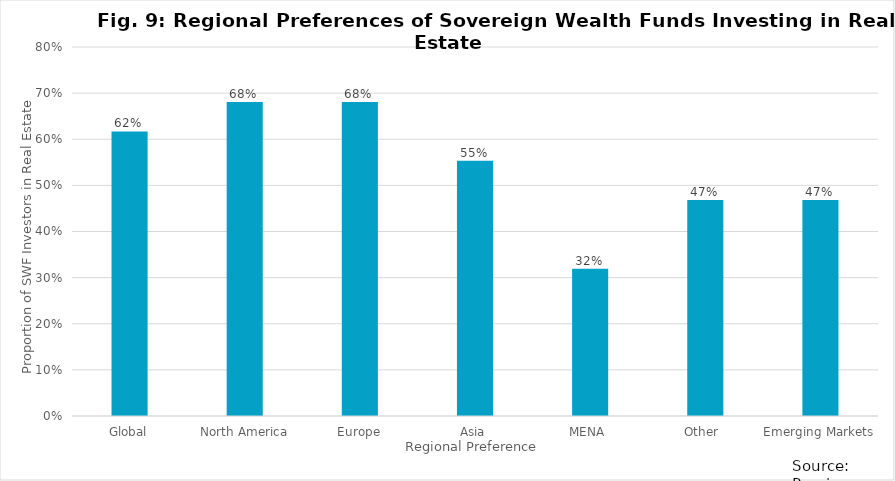
| Category | Series 0 |
|---|---|
| Global | 0.617 |
| North America | 0.681 |
| Europe | 0.681 |
| Asia | 0.553 |
| MENA  | 0.319 |
| Other  | 0.468 |
| Emerging Markets | 0.468 |